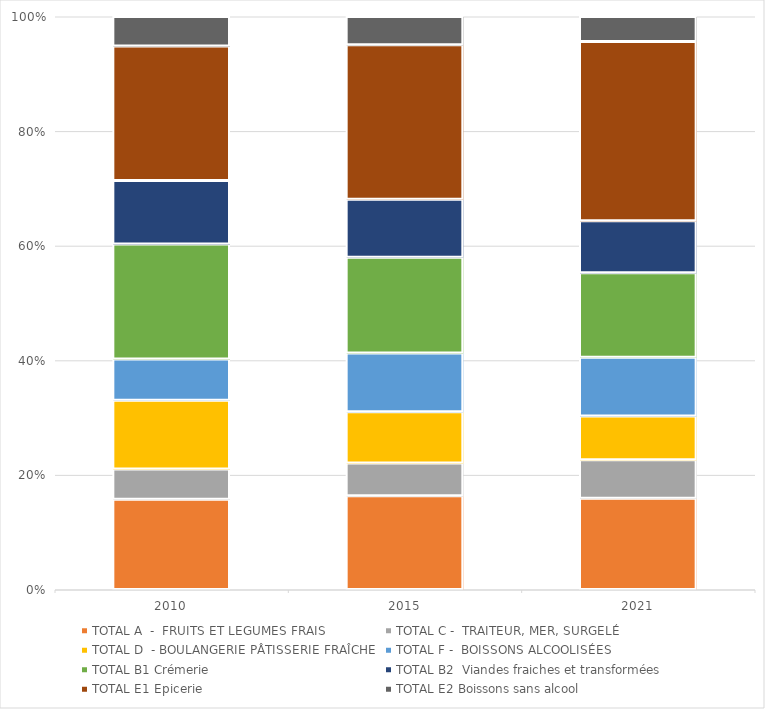
| Category | TOTAL A  -  FRUITS ET LEGUMES FRAIS | TOTAL C -  TRAITEUR, MER, SURGELÉ | TOTAL D  - BOULANGERIE PÂTISSERIE FRAÎCHE | TOTAL F -  BOISSONS ALCOOLISÉES | TOTAL B1 Crémerie | TOTAL B2  Viandes fraiches et transformées | TOTAL E1 Epicerie | TOTAL E2 Boissons sans alcool |
|---|---|---|---|---|---|---|---|---|
| 2010.0 | 568 | 191 | 433 | 260 | 726 | 399 | 848 | 186 |
| 2015.0 | 975 | 343 | 533 | 611 | 999 | 603 | 1609 | 294 |
| 2021.0 | 2015 | 848 | 970 | 1296 | 1867 | 1149 | 3956 | 552 |